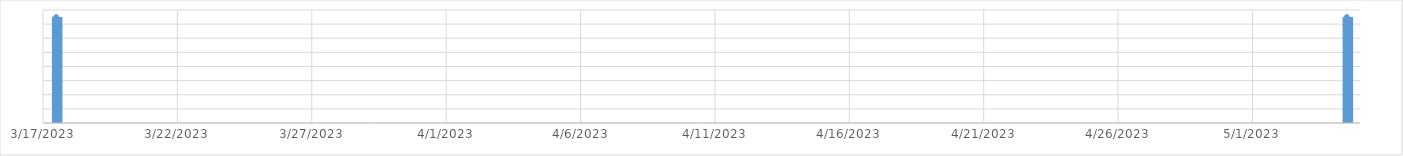
| Category | bar |
|---|---|
| 3/17/23 | 1.5 |
| nan | 1 |
| nan | 0.75 |
| nan | 0.3 |
| nan | 1 |
| nan | 0.75 |
| nan | 0.3 |
| nan | 1 |
| nan | 0.75 |
| nan | 0.3 |
| nan | 1 |
| nan | 0.75 |
| nan | 0.3 |
| nan | 1 |
| nan | 0.75 |
| nan | 0.3 |
| 5/5/23 | 1.5 |